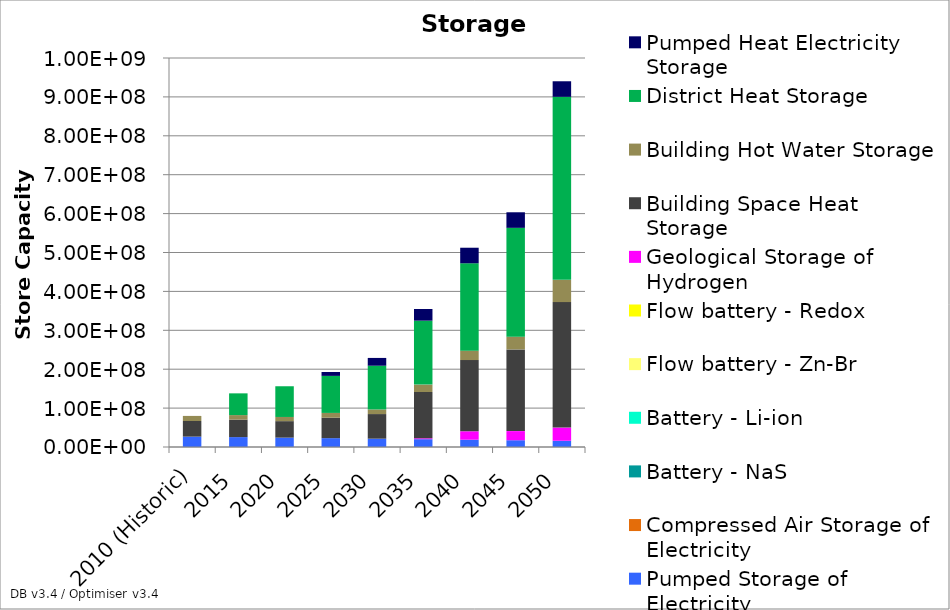
| Category | Pumped Storage of Electricity | Compressed Air Storage of Electricity | Battery - NaS | Battery - Li-ion | Flow battery - Zn-Br | Flow battery - Redox | Geological Storage of Hydrogen | Building Space Heat Storage | Building Hot Water Storage | District Heat Storage | Pumped Heat Electricity Storage |
|---|---|---|---|---|---|---|---|---|---|---|---|
| 2010 (Historic) | 26700000 | 0 | 0 | 0 | 0 | 0 | 0 | 40100000 | 13100000 | 0 | 0 |
| 2015 | 25460000 | 0 | 0 | 0 | 0 | 0 | 0 | 44890325.263 | 11672923.797 | 55881368.097 | 0 |
| 2020 | 24120000 | 0 | 0 | 0 | 0 | 0 | 0.001 | 42348054.086 | 10736631.473 | 78959667.491 | 0 |
| 2025 | 22780000 | 0 | 0 | 0 | 0 | 0 | 7.571 | 52552141.09 | 12272567.047 | 95212119.555 | 10000000 |
| 2030 | 21440000 | 0.001 | 0 | 0 | 0 | 0 | 7.572 | 63227197.351 | 11892398.125 | 112407686.531 | 20000000 |
| 2035 | 20100000 | 0.001 | 0 | 0 | 0 | 0 | 2305563.58 | 119052639.83 | 18953124.215 | 164350976.651 | 30000000 |
| 2040 | 18760000 | 0.001 | 0 | 0 | 0 | 0 | 21589373.683 | 183157791.878 | 24144250.587 | 224614952.542 | 40000000 |
| 2045 | 17420000 | 0.001 | 0 | 0 | 0 | 0 | 23444499.772 | 210024041.525 | 32710966.483 | 279808438.165 | 40000000 |
| 2050 | 16080000 | 0.001 | 0 | 0 | 0 | 0 | 33842292.727 | 322621197.911 | 57138809.387 | 470513004.906 | 40000000 |